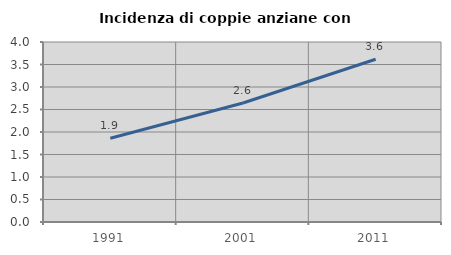
| Category | Incidenza di coppie anziane con figli |
|---|---|
| 1991.0 | 1.86 |
| 2001.0 | 2.646 |
| 2011.0 | 3.616 |